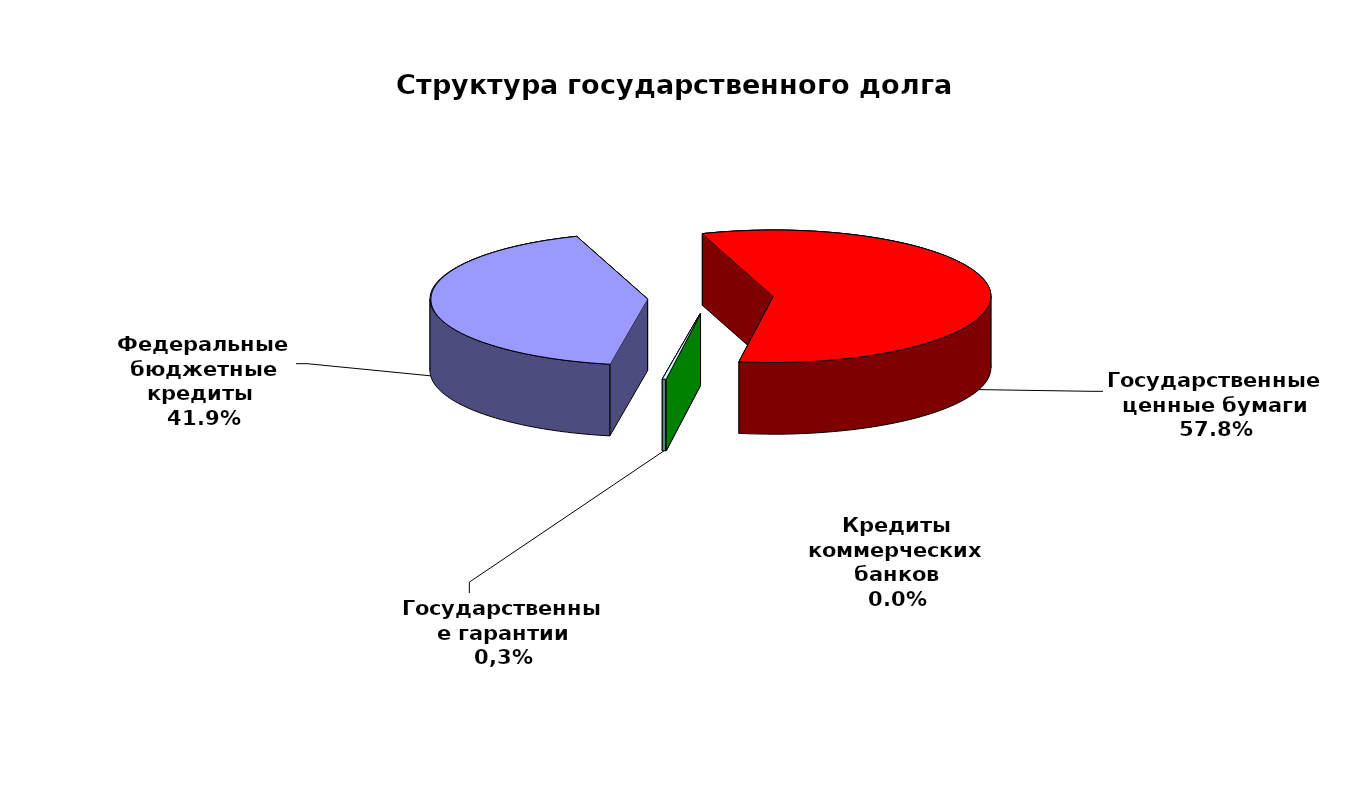
| Category | Series 0 |
|---|---|
| Федеральные бюджетные кредиты  | 28654967.463 |
| Государственные ценные бумаги | 39500000 |
| Кредиты коммерческих банков | 0 |
| Государственные гарантии | 174735.36 |